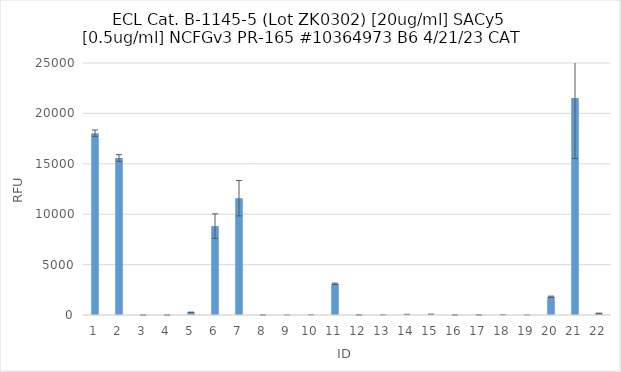
| Category | RFU |
|---|---|
| 0 | 18036.75 |
| 1 | 15576 |
| 2 | 1.25 |
| 3 | 1.25 |
| 4 | 267.25 |
| 5 | 8818.25 |
| 6 | 11586.25 |
| 7 | 7.75 |
| 8 | 2.5 |
| 9 | 7 |
| 10 | 3090 |
| 11 | 10.75 |
| 12 | 5.75 |
| 13 | -42.75 |
| 14 | -39.5 |
| 15 | 6.5 |
| 16 | 8.75 |
| 17 | 11.75 |
| 18 | 2.75 |
| 19 | 1804.5 |
| 20 | 21524 |
| 21 | 160.5 |